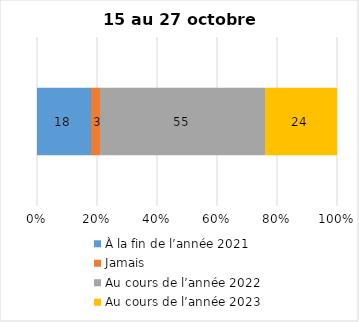
| Category | À la fin de l’année 2021 | Jamais | Au cours de l’année 2022 | Au cours de l’année 2023 |
|---|---|---|---|---|
| 0 | 18 | 3 | 55 | 24 |